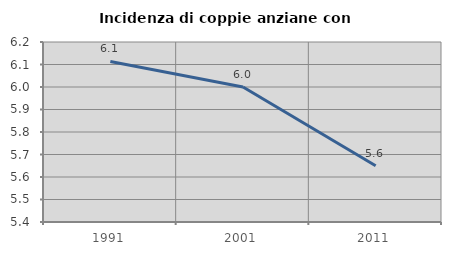
| Category | Incidenza di coppie anziane con figli |
|---|---|
| 1991.0 | 6.114 |
| 2001.0 | 6 |
| 2011.0 | 5.65 |